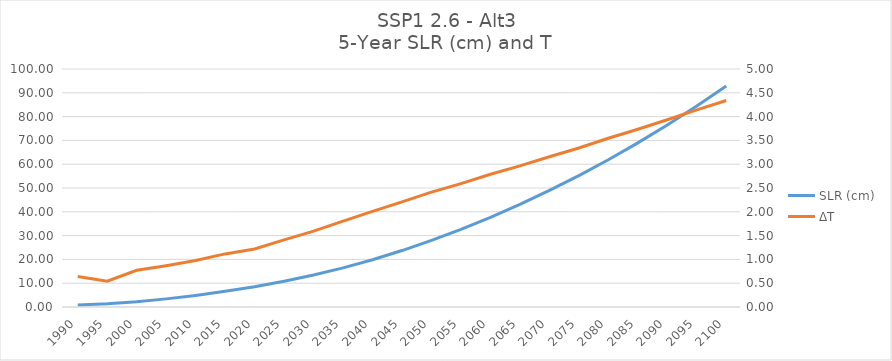
| Category | SLR (cm) |
|---|---|
| 1990.0 | 0.851 |
| 1995.0 | 1.315 |
| 2000.0 | 2.215 |
| 2005.0 | 3.412 |
| 2010.0 | 4.865 |
| 2015.0 | 6.592 |
| 2020.0 | 8.518 |
| 2025.0 | 10.794 |
| 2030.0 | 13.413 |
| 2035.0 | 16.438 |
| 2040.0 | 19.874 |
| 2045.0 | 23.717 |
| 2050.0 | 27.992 |
| 2055.0 | 32.638 |
| 2060.0 | 37.699 |
| 2065.0 | 43.128 |
| 2070.0 | 48.966 |
| 2075.0 | 55.194 |
| 2080.0 | 61.87 |
| 2085.0 | 68.954 |
| 2090.0 | 76.48 |
| 2095.0 | 84.474 |
| 2100.0 | 92.903 |